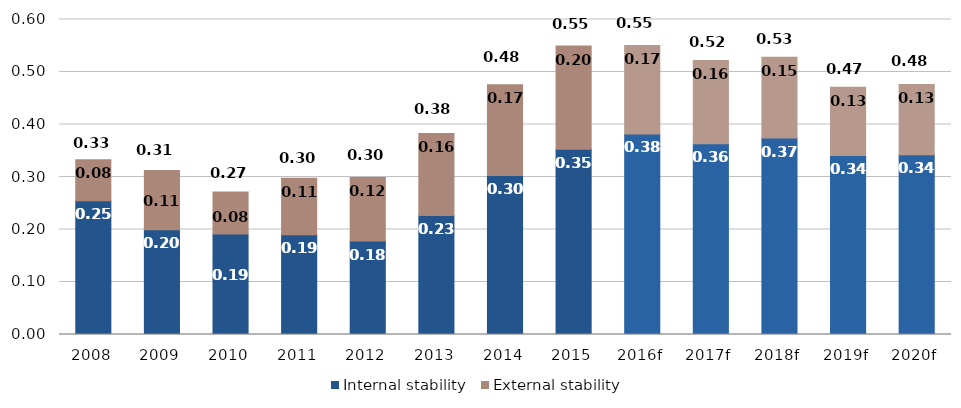
| Category | Internal stability | External stability |
|---|---|---|
| 2008 | 0.255 | 0.078 |
| 2009 | 0.199 | 0.113 |
| 2010 | 0.191 | 0.08 |
| 2011 | 0.19 | 0.107 |
| 2012 | 0.178 | 0.121 |
| 2013 | 0.227 | 0.156 |
| 2014 | 0.303 | 0.173 |
| 2015 | 0.353 | 0.196 |
| 2016f | 0.382 | 0.169 |
| 2017f | 0.363 | 0.158 |
| 2018f | 0.374 | 0.154 |
| 2019f | 0.341 | 0.13 |
| 2020f | 0.342 | 0.134 |